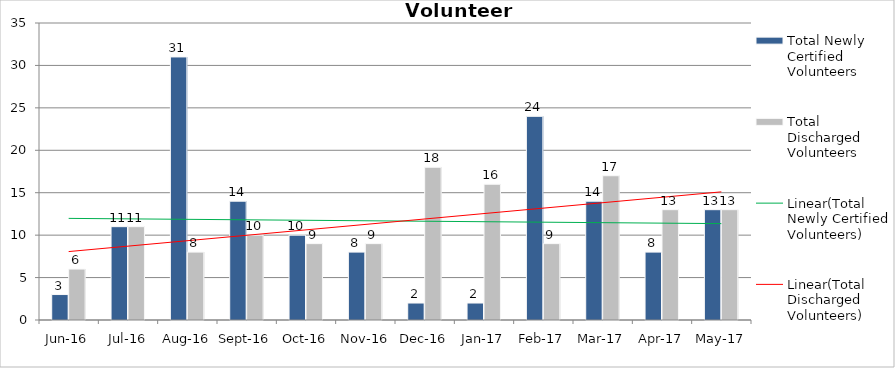
| Category | Total Newly Certified Volunteers | Total Discharged Volunteers |
|---|---|---|
| Jun-16 | 3 | 6 |
| Jul-16 | 11 | 11 |
| Aug-16 | 31 | 8 |
| Sep-16 | 14 | 10 |
| Oct-16 | 10 | 9 |
| Nov-16 | 8 | 9 |
| Dec-16 | 2 | 18 |
| Jan-17 | 2 | 16 |
| Feb-17 | 24 | 9 |
| Mar-17 | 14 | 17 |
| Apr-17 | 8 | 13 |
| May-17 | 13 | 13 |